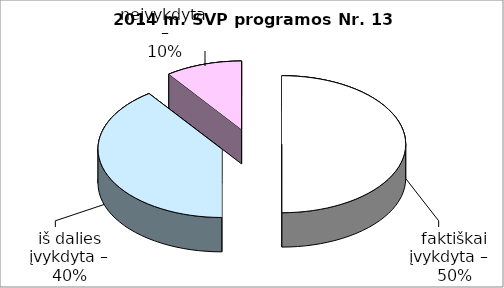
| Category | Series 0 |
|---|---|
| faktiškai įvykdyta –   | 5 |
| iš dalies įvykdyta – | 4 |
| neįvykdyta – | 1 |